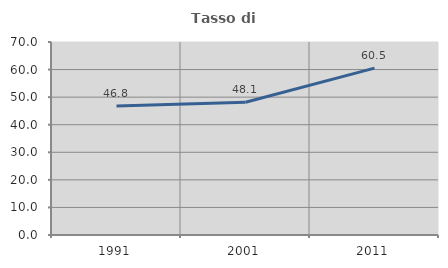
| Category | Tasso di occupazione   |
|---|---|
| 1991.0 | 46.809 |
| 2001.0 | 48.148 |
| 2011.0 | 60.526 |